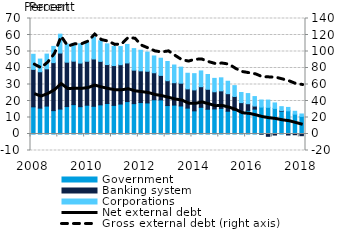
| Category | Government | Banking system | Corporations |
|---|---|---|---|
| 2008.0 | 16.458 | 22.717 | 9.14 |
| 2008.0 | 15.678 | 22.055 | 7.675 |
| 2008.0 | 16.911 | 22.584 | 8.93 |
| 2008.0 | 14.165 | 29.091 | 9.81 |
| 2009.0 | 15.12 | 33.952 | 11.428 |
| 2009.0 | 16.633 | 26.901 | 10.915 |
| 2009.0 | 17.803 | 26.337 | 10.762 |
| 2009.0 | 16.57 | 26.423 | 11.68 |
| 2010.0 | 17.44 | 26.648 | 11.56 |
| 2010.0 | 16.789 | 28.67 | 13.269 |
| 2010.0 | 17.654 | 26.372 | 12.438 |
| 2010.0 | 18.488 | 23.599 | 12.53 |
| 2011.0 | 17.326 | 24.136 | 11.631 |
| 2011.0 | 18.16 | 23.834 | 10.999 |
| 2011.0 | 19.654 | 23.412 | 11.221 |
| 2011.0 | 18.396 | 20.305 | 13.058 |
| 2012.0 | 19.065 | 19.204 | 12.504 |
| 2012.0 | 18.824 | 19.213 | 11.61 |
| 2012.0 | 20.746 | 16.378 | 10.159 |
| 2012.0 | 20.671 | 14.844 | 10.407 |
| 2013.0 | 17.237 | 15.065 | 11.622 |
| 2013.0 | 17.514 | 13.574 | 10.72 |
| 2013.0 | 16.981 | 13.818 | 9.731 |
| 2013.0 | 15.691 | 11.651 | 9.472 |
| 2014.0 | 14.036 | 12.686 | 9.85 |
| 2014.0 | 16.184 | 12.491 | 9.552 |
| 2014.0 | 15.007 | 12.102 | 8.952 |
| 2014.0 | 15.185 | 10.409 | 8.114 |
| 2015.0 | 15.517 | 10.639 | 7.886 |
| 2015.0 | 13.799 | 10.641 | 7.534 |
| 2015.0 | 14.281 | 8.468 | 6.565 |
| 2015.0 | 13.228 | 5.779 | 6.14 |
| 2016.0 | 14.317 | 4.04 | 6.154 |
| 2016.0 | 15.082 | 1.844 | 5.758 |
| 2016.0 | 16.322 | -0.085 | 4.28 |
| 2016.0 | 16.18 | -1.412 | 4.388 |
| 2017.0 | 15.523 | -0.633 | 3.307 |
| 2017.0 | 13.807 | 0.353 | 2.408 |
| 2017.0 | 14.058 | -0.619 | 2.054 |
| 2017.0 | 12.027 | -0.438 | 1.742 |
| 2018.0 | 10.663 | -1.028 | 1.47 |